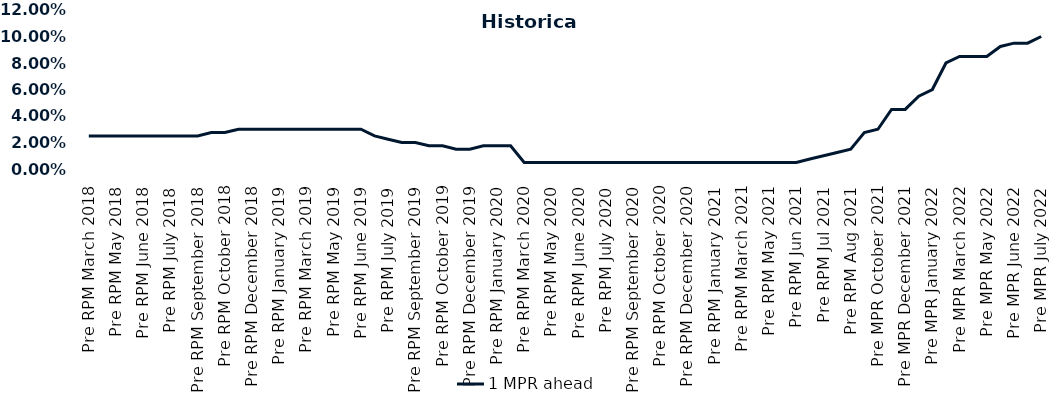
| Category | 1 MPR ahead |
|---|---|
| Pre RPM March 2018 | 0.025 |
| Post RPM March 2018 | 0.025 |
| Pre RPM May 2018 | 0.025 |
| Post RPM May 2018 | 0.025 |
| Pre RPM June 2018 | 0.025 |
| Post RPM June 2018 | 0.025 |
| Pre RPM July 2018 | 0.025 |
| Post RPM July 2018 | 0.025 |
| Pre RPM September 2018 | 0.025 |
| Post RPM September 2018 | 0.028 |
| Pre RPM October 2018 | 0.028 |
| Post RPM October 2018 | 0.03 |
| Pre RPM December 2018 | 0.03 |
| Post RPM December 2018 | 0.03 |
| Pre RPM January 2019 | 0.03 |
| Post RPM January 2019 | 0.03 |
| Pre RPM March 2019 | 0.03 |
| Post RPM March 2019 | 0.03 |
| Pre RPM May 2019 | 0.03 |
| Post RPM May 2019 | 0.03 |
| Pre RPM June 2019 | 0.03 |
| Post RPM June 2019 | 0.025 |
| Pre RPM July 2019 | 0.022 |
| Post RPM July 2019 | 0.02 |
| Pre RPM September 2019 | 0.02 |
| Post RPM September 2019 | 0.018 |
| Pre RPM October 2019 | 0.018 |
| Post RPM October 2019 | 0.015 |
| Pre RPM December 2019 | 0.015 |
| Post RPM December 2019 | 0.018 |
| Pre RPM January 2020 | 0.018 |
| Post RPM January 2020 | 0.018 |
| Pre RPM March 2020 | 0.005 |
| Post RPM March 2020 | 0.005 |
| Pre RPM May 2020 | 0.005 |
| Post RPM May 2020 | 0.005 |
| Pre RPM June 2020 | 0.005 |
| Post RPM June 2020 | 0.005 |
| Pre RPM July 2020 | 0.005 |
| Post RPM July 2020 | 0.005 |
| Pre RPM September 2020 | 0.005 |
| Post RPM September 2020 | 0.005 |
| Pre RPM October 2020 | 0.005 |
| Post RPM October 2020 | 0.005 |
| Pre RPM December 2020 | 0.005 |
|  Post RPM December 2020 | 0.005 |
| Pre RPM January 2021 | 0.005 |
| Post RPM January 2021 | 0.005 |
|  Pre RPM March 2021 | 0.005 |
|  Post RPM March 2021 | 0.005 |
|  Pre RPM May 2021 | 0.005 |
|  Post RPM May 2021 | 0.005 |
|  Pre RPM Jun 2021 | 0.005 |
|   Post RPM Jun 2021 | 0.008 |
| Pre RPM Jul 2021 | 0.01 |
|  Post RPM Jul 2021 | 0.012 |
| Pre RPM Aug 2021 | 0.015 |
|  Post RPM Aug 2021 | 0.028 |
| Pre MPR October 2021 | 0.03 |
| Post MPR October 2021 | 0.045 |
| Pre MPR December 2021 | 0.045 |
| Post MPR December 2021 | 0.055 |
| Pre MPR January 2022 | 0.06 |
| Post MPR January 2022 | 0.08 |
| Pre MPR March 2022 | 0.085 |
| Post MPR March 2022 | 0.085 |
| Pre MPR May 2022 | 0.085 |
| Post MPR May 2022 | 0.092 |
| Pre MPR June 2022 | 0.095 |
| Post MPR June 2022 | 0.095 |
| Pre MPR July 2022 | 0.1 |